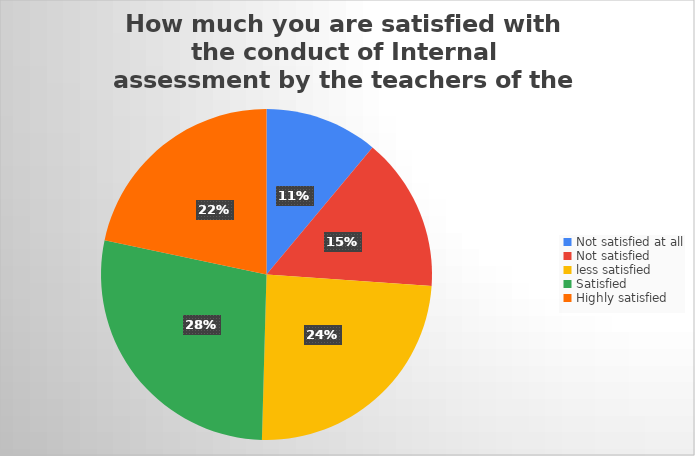
| Category | Series 0 |
|---|---|
| Not satisfied at all | 25 |
| Not satisfied  | 34 |
| less satisfied | 55 |
| Satisfied | 63 |
| Highly satisfied | 49 |